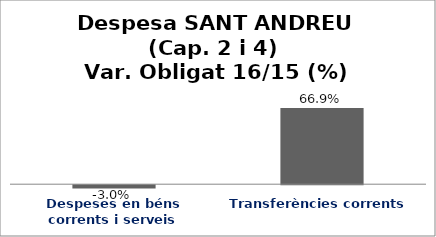
| Category | Series 0 |
|---|---|
| Despeses en béns corrents i serveis | -0.03 |
| Transferències corrents | 0.669 |